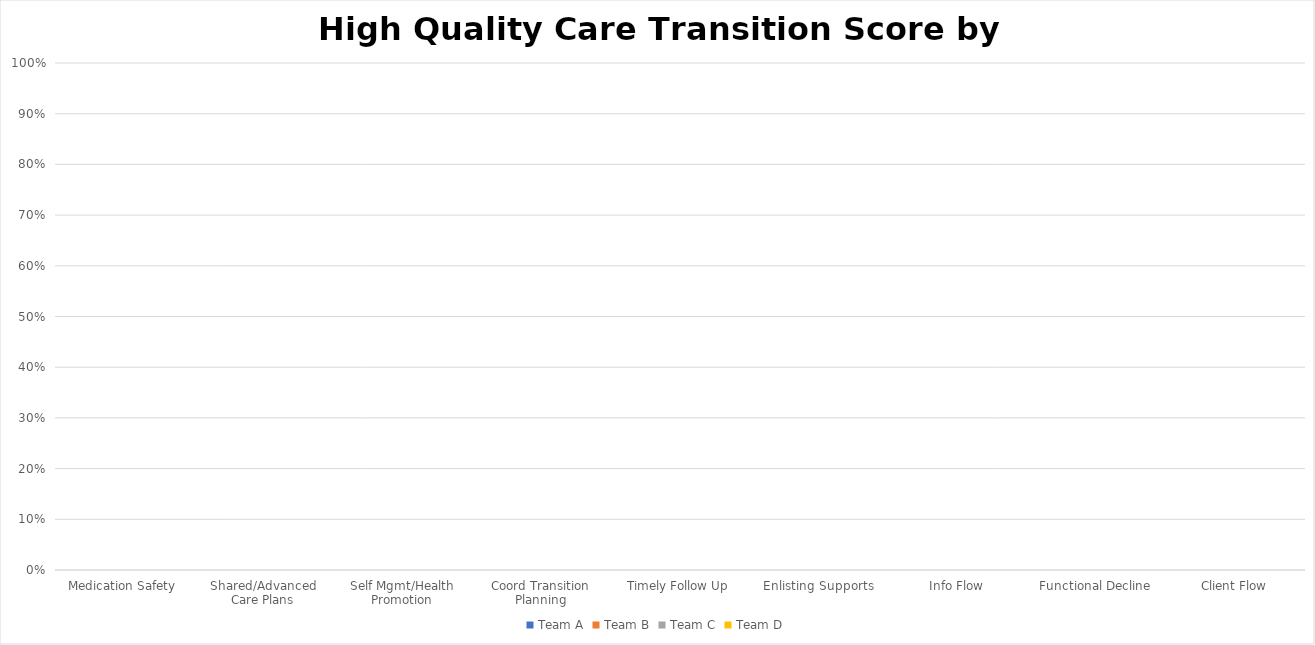
| Category | Team A | Team B | Team C | Team D |
|---|---|---|---|---|
| Medication Safety | 0 | 0 | 0 | 0 |
| Shared/Advanced Care Plans | 0 | 0 | 0 | 0 |
| Self Mgmt/Health Promotion | 0 | 0 | 0 | 0 |
| Coord Transition Planning | 0 | 0 | 0 | 0 |
| Timely Follow Up | 0 | 0 | 0 | 0 |
| Enlisting Supports | 0 | 0 | 0 | 0 |
| Info Flow | 0 | 0 | 0 | 0 |
| Functional Decline | 0 | 0 | 0 | 0 |
| Client Flow | 0 | 0 | 0 | 0 |